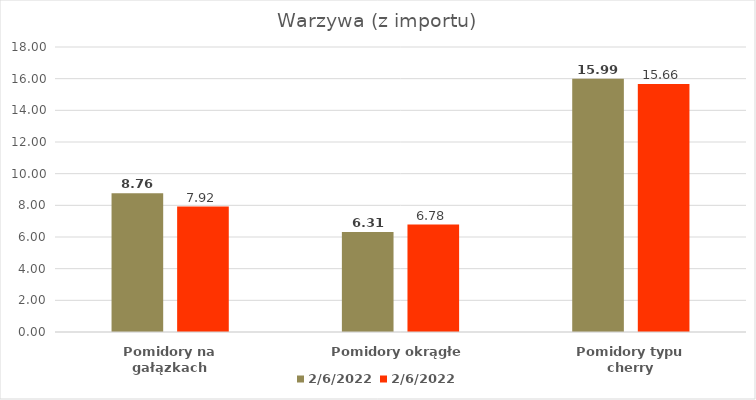
| Category | 06.02.2022 |
|---|---|
| Pomidory na gałązkach | 7.924 |
| Pomidory okrągłe | 6.783 |
| Pomidory typu cherry | 15.659 |